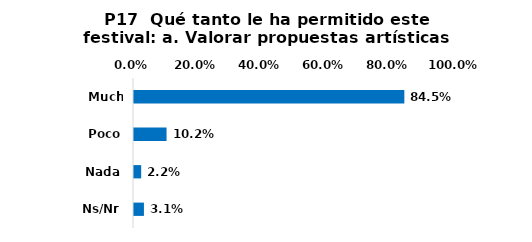
| Category | Series 0 |
|---|---|
| Mucho | 0.845 |
| Poco | 0.102 |
| Nada | 0.022 |
| Ns/Nr | 0.031 |